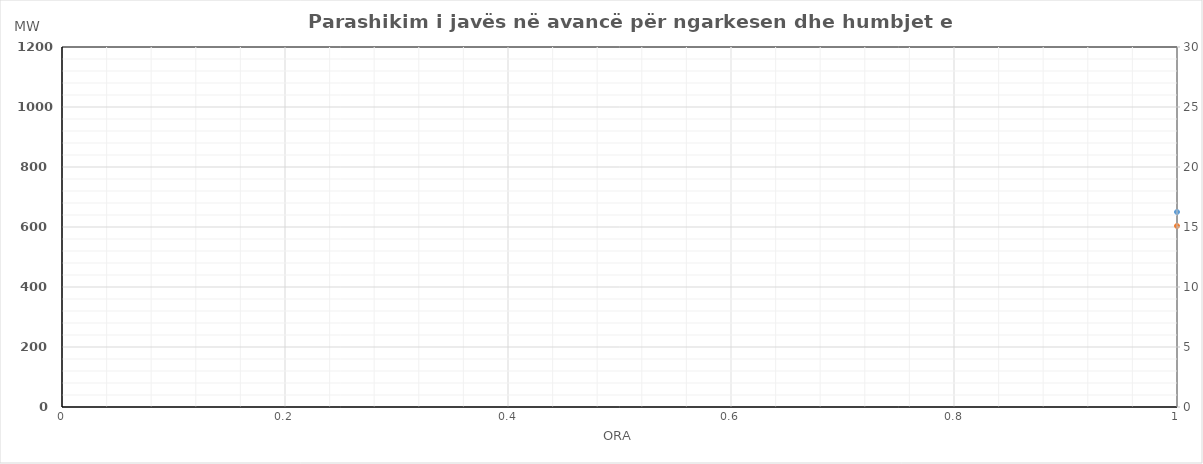
| Category | Ngarkesa (MWh) |
|---|---|
| 0 | 603.453 |
| 1 | 553.403 |
| 2 | 531.416 |
| 3 | 517.547 |
| 4 | 525.668 |
| 5 | 560.127 |
| 6 | 695.077 |
| 7 | 820.086 |
| 8 | 894.314 |
| 9 | 926.917 |
| 10 | 937.951 |
| 11 | 950.406 |
| 12 | 945.443 |
| 13 | 946.407 |
| 14 | 935.038 |
| 15 | 917.514 |
| 16 | 909.654 |
| 17 | 927.181 |
| 18 | 932.341 |
| 19 | 924.916 |
| 20 | 967.329 |
| 21 | 963.559 |
| 22 | 862.13 |
| 23 | 739.243 |
| 24 | 596.141 |
| 25 | 542.399 |
| 26 | 520.669 |
| 27 | 511.724 |
| 28 | 519.055 |
| 29 | 552.99 |
| 30 | 691.456 |
| 31 | 823.416 |
| 32 | 898.883 |
| 33 | 921.195 |
| 34 | 928.786 |
| 35 | 946.143 |
| 36 | 949.55 |
| 37 | 951.008 |
| 38 | 943.365 |
| 39 | 921.651 |
| 40 | 916.321 |
| 41 | 926.077 |
| 42 | 914.062 |
| 43 | 894.007 |
| 44 | 927.124 |
| 45 | 932.718 |
| 46 | 821.465 |
| 47 | 695.632 |
| 48 | 593.76 |
| 49 | 539.707 |
| 50 | 513.626 |
| 51 | 503.391 |
| 52 | 506.464 |
| 53 | 541.184 |
| 54 | 683.1 |
| 55 | 814.862 |
| 56 | 896.218 |
| 57 | 898.131 |
| 58 | 903.57 |
| 59 | 924.401 |
| 60 | 920.837 |
| 61 | 924.467 |
| 62 | 909.546 |
| 63 | 905.693 |
| 64 | 898.764 |
| 65 | 909.912 |
| 66 | 901.345 |
| 67 | 897.899 |
| 68 | 926.965 |
| 69 | 923.794 |
| 70 | 822.682 |
| 71 | 699.123 |
| 72 | 618.59 |
| 73 | 562.883 |
| 74 | 528.24 |
| 75 | 515.647 |
| 76 | 517.874 |
| 77 | 546.007 |
| 78 | 618.38 |
| 79 | 750.363 |
| 80 | 823.744 |
| 81 | 880.5 |
| 82 | 910.489 |
| 83 | 933.193 |
| 84 | 940.53 |
| 85 | 953.686 |
| 86 | 945.477 |
| 87 | 921.936 |
| 88 | 911.455 |
| 89 | 918.474 |
| 90 | 922.818 |
| 91 | 909.167 |
| 92 | 938.974 |
| 93 | 937.431 |
| 94 | 826.27 |
| 95 | 691.42 |
| 96 | 603.506 |
| 97 | 548.928 |
| 98 | 522.403 |
| 99 | 516.314 |
| 100 | 520.981 |
| 101 | 550.118 |
| 102 | 645.283 |
| 103 | 774.782 |
| 104 | 870.725 |
| 105 | 903.889 |
| 106 | 920.077 |
| 107 | 933.784 |
| 108 | 944.91 |
| 109 | 957.534 |
| 110 | 942.086 |
| 111 | 918.154 |
| 112 | 905.065 |
| 113 | 926.155 |
| 114 | 934.247 |
| 115 | 928.804 |
| 116 | 970.745 |
| 117 | 968.592 |
| 118 | 852.892 |
| 119 | 718.407 |
| 120 | 635.89 |
| 121 | 584.389 |
| 122 | 558.49 |
| 123 | 549.412 |
| 124 | 551.556 |
| 125 | 587.843 |
| 126 | 657.906 |
| 127 | 740.847 |
| 128 | 813.402 |
| 129 | 847.199 |
| 130 | 878.378 |
| 131 | 896.121 |
| 132 | 913.72 |
| 133 | 907.553 |
| 134 | 866.014 |
| 135 | 861.048 |
| 136 | 890.873 |
| 137 | 909.452 |
| 138 | 935.569 |
| 139 | 940.237 |
| 140 | 983.576 |
| 141 | 980.176 |
| 142 | 865.125 |
| 143 | 737.777 |
| 144 | 598.141 |
| 145 | 544.399 |
| 146 | 522.669 |
| 147 | 513.724 |
| 148 | 521.055 |
| 149 | 554.99 |
| 150 | 693.456 |
| 151 | 825.416 |
| 152 | 900.883 |
| 153 | 924.195 |
| 154 | 931.786 |
| 155 | 949.143 |
| 156 | 952.55 |
| 157 | 954.008 |
| 158 | 946.365 |
| 159 | 924.651 |
| 160 | 919.321 |
| 161 | 929.077 |
| 162 | 917.062 |
| 163 | 897.007 |
| 164 | 930.124 |
| 165 | 935.718 |
| 166 | 824.465 |
| 167 | 695.632 |